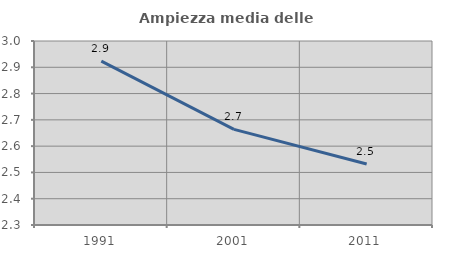
| Category | Ampiezza media delle famiglie |
|---|---|
| 1991.0 | 2.923 |
| 2001.0 | 2.664 |
| 2011.0 | 2.532 |